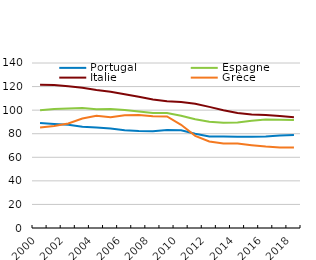
| Category | Portugal | Espagne | Italie | Grèce |
|---|---|---|---|---|
| 2000.0 | 89.019 | 99.93 | 121.525 | 85.294 |
| 2001.0 | 88.324 | 101.043 | 121.334 | 86.558 |
| 2002.0 | 87.657 | 101.308 | 120.228 | 88.71 |
| 2003.0 | 85.928 | 101.74 | 119.007 | 92.961 |
| 2004.0 | 85.253 | 100.723 | 117.122 | 95.166 |
| 2005.0 | 84.359 | 100.952 | 115.562 | 93.878 |
| 2006.0 | 82.861 | 100.033 | 113.54 | 95.737 |
| 2007.0 | 82.348 | 98.819 | 111.352 | 95.785 |
| 2008.0 | 82.106 | 97.651 | 109.003 | 94.76 |
| 2009.0 | 83.142 | 97.526 | 107.632 | 94.704 |
| 2010.0 | 82.84 | 95.263 | 106.926 | 87.591 |
| 2011.0 | 79.987 | 92.302 | 105.414 | 78.17 |
| 2012.0 | 77.652 | 90.209 | 102.759 | 73.405 |
| 2013.0 | 77.542 | 89.404 | 99.921 | 71.707 |
| 2014.0 | 77.491 | 89.618 | 97.611 | 71.682 |
| 2015.0 | 77.4 | 91.056 | 96.291 | 70.242 |
| 2016.0 | 77.712 | 91.967 | 95.838 | 69.061 |
| 2017.0 | 78.485 | 91.892 | 95.018 | 68.368 |
| 2018.0 | 78.826 | 91.66 | 93.908 | 68.354 |